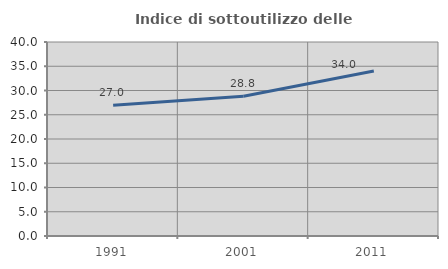
| Category | Indice di sottoutilizzo delle abitazioni  |
|---|---|
| 1991.0 | 26.971 |
| 2001.0 | 28.832 |
| 2011.0 | 34.003 |